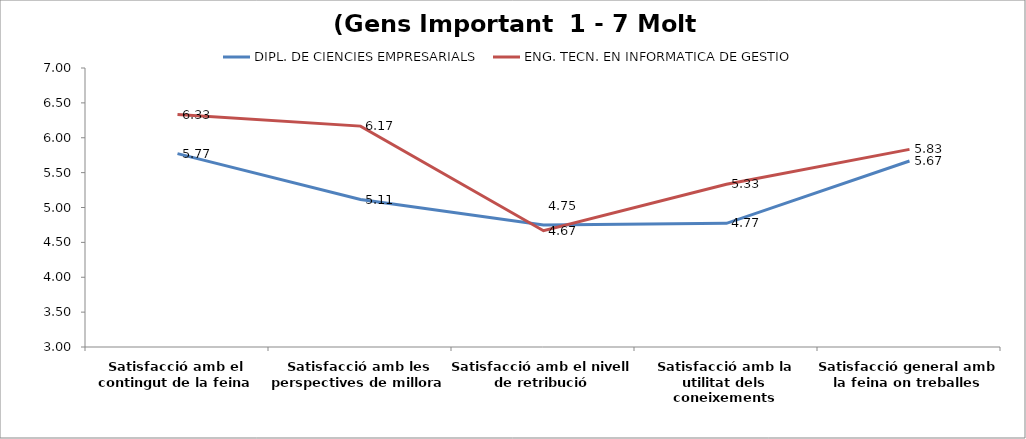
| Category | DIPL. DE CIENCIES EMPRESARIALS | ENG. TECN. EN INFORMATICA DE GESTIO |
|---|---|---|
| Satisfacció amb el contingut de la feina | 5.773 | 6.333 |
| Satisfacció amb les perspectives de millora | 5.114 | 6.167 |
| Satisfacció amb el nivell de retribució | 4.75 | 4.667 |
| Satisfacció amb la utilitat dels coneixements | 4.773 | 5.333 |
| Satisfacció general amb la feina on treballes | 5.667 | 5.833 |